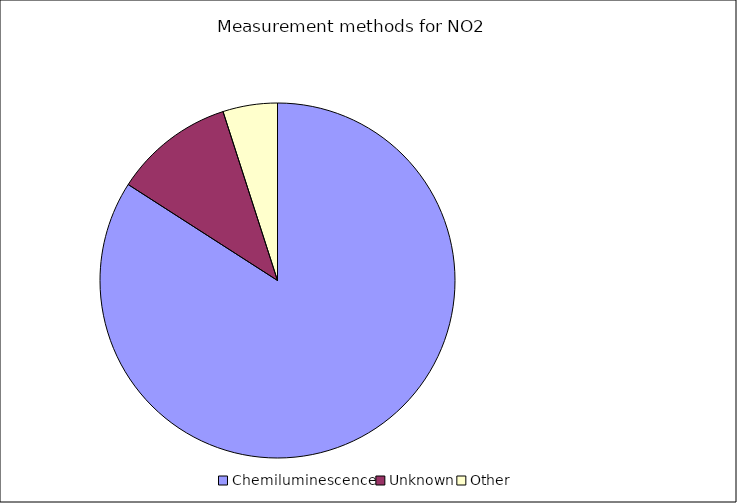
| Category | Series 0 |
|---|---|
| Chemiluminescence | 84.092 |
| Unknown | 10.944 |
| Other | 4.964 |